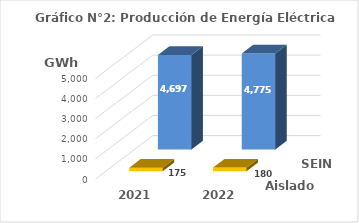
| Category | Aislados | SEIN |
|---|---|---|
| 2021.0 | 175.298 | 4696.654 |
| 2022.0 | 179.569 | 4775.191 |